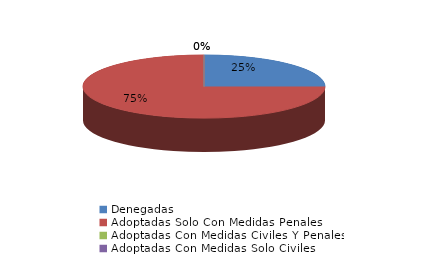
| Category | Series 0 |
|---|---|
| Denegadas | 1 |
| Adoptadas Solo Con Medidas Penales | 3 |
| Adoptadas Con Medidas Civiles Y Penales | 0 |
| Adoptadas Con Medidas Solo Civiles | 0 |